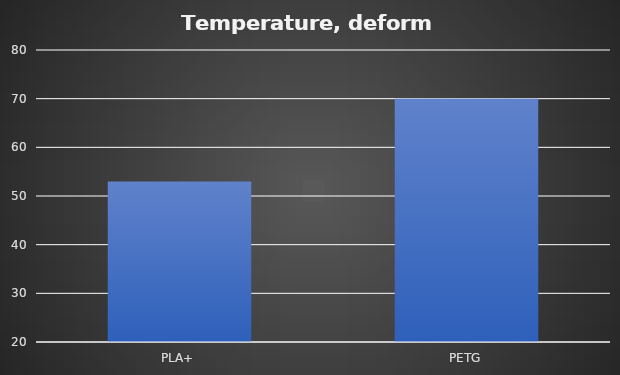
| Category | Deform °C |
|---|---|
| PLA+ | 53 |
| PETG | 70 |